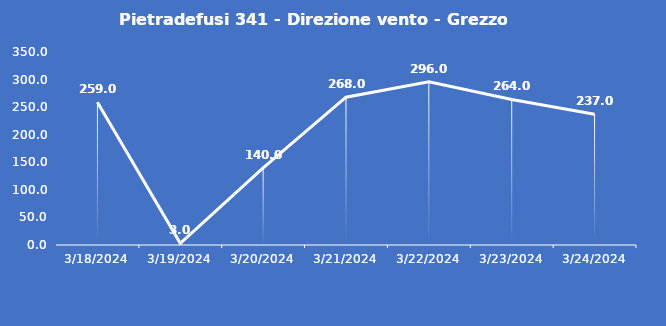
| Category | Pietradefusi 341 - Direzione vento - Grezzo (°N) |
|---|---|
| 3/18/24 | 259 |
| 3/19/24 | 3 |
| 3/20/24 | 140 |
| 3/21/24 | 268 |
| 3/22/24 | 296 |
| 3/23/24 | 264 |
| 3/24/24 | 237 |